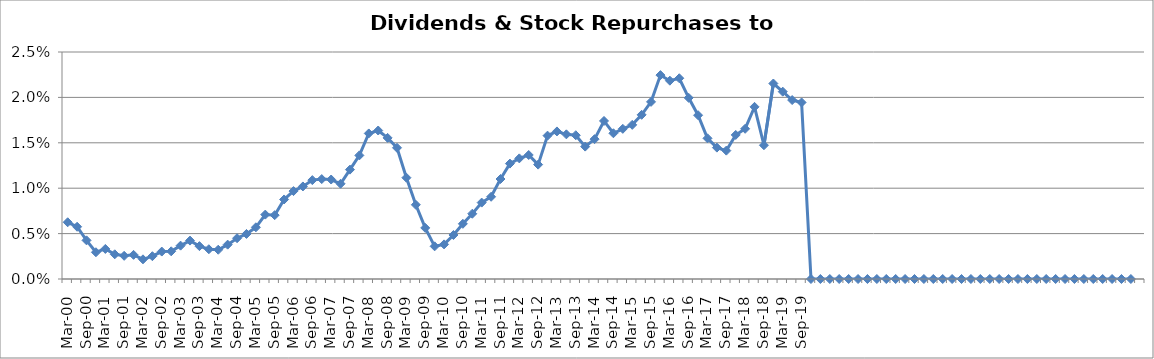
| Category | Dividends & Stock Repurchases to Revenue% |
|---|---|
| Mar-00 | 0.006 |
| Jun-00 | 0.006 |
| Sep-00 | 0.004 |
| Dec-00 | 0.003 |
| Mar-01 | 0.003 |
| Jun-01 | 0.003 |
| Sep-01 | 0.003 |
| Dec-01 | 0.003 |
| Mar-02 | 0.002 |
| Jun-02 | 0.003 |
| Sep-02 | 0.003 |
| Dec-02 | 0.003 |
| Mar-03 | 0.004 |
| Jun-03 | 0.004 |
| Sep-03 | 0.004 |
| Dec-03 | 0.003 |
| Mar-04 | 0.003 |
| Jun-04 | 0.004 |
| Sep-04 | 0.004 |
| Dec-04 | 0.005 |
| Mar-05 | 0.006 |
| Jun-05 | 0.007 |
| Sep-05 | 0.007 |
| Dec-05 | 0.009 |
| Mar-06 | 0.01 |
| Jun-06 | 0.01 |
| Sep-06 | 0.011 |
| Dec-06 | 0.011 |
| Mar-07 | 0.011 |
| Jun-07 | 0.01 |
| Sep-07 | 0.012 |
| Dec-07 | 0.014 |
| Mar-08 | 0.016 |
| Jun-08 | 0.016 |
| Sep-08 | 0.016 |
| Dec-08 | 0.014 |
| Mar-09 | 0.011 |
| Jun-09 | 0.008 |
| Sep-09 | 0.006 |
| Dec-09 | 0.004 |
| Mar-10 | 0.004 |
| Jun-10 | 0.005 |
| Sep-10 | 0.006 |
| Dec-10 | 0.007 |
| Mar-11 | 0.008 |
| Jun-11 | 0.009 |
| Sep-11 | 0.011 |
| Dec-11 | 0.013 |
| Mar-12 | 0.013 |
| Jun-12 | 0.014 |
| Sep-12 | 0.013 |
| Dec-12 | 0.016 |
| Mar-13 | 0.016 |
| Jun-13 | 0.016 |
| Sep-13 | 0.016 |
| Dec-13 | 0.015 |
| Mar-14 | 0.015 |
| Jun-14 | 0.017 |
| Sep-14 | 0.016 |
| Dec-14 | 0.017 |
| Mar-15 | 0.017 |
| Jun-15 | 0.018 |
| Sep-15 | 0.02 |
| Dec-15 | 0.022 |
| Mar-16 | 0.022 |
| Jun-16 | 0.022 |
| Sep-16 | 0.02 |
| Dec-16 | 0.018 |
| Mar-17 | 0.015 |
| Jun-17 | 0.014 |
| Sep-17 | 0.014 |
| Dec-17 | 0.016 |
| Mar-18 | 0.017 |
| Jun-18 | 0.019 |
| Sep-18 | 0.015 |
| Dec-18 | 0.022 |
| Mar-19 | 0.021 |
| Jun-19 | 0.02 |
| Sep-19 | 0.019 |